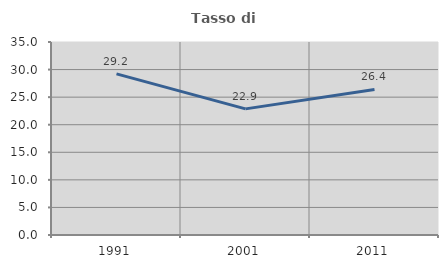
| Category | Tasso di occupazione   |
|---|---|
| 1991.0 | 29.211 |
| 2001.0 | 22.874 |
| 2011.0 | 26.398 |